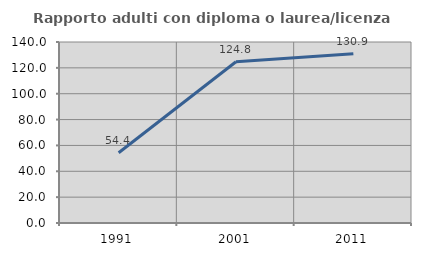
| Category | Rapporto adulti con diploma o laurea/licenza media  |
|---|---|
| 1991.0 | 54.369 |
| 2001.0 | 124.762 |
| 2011.0 | 130.909 |